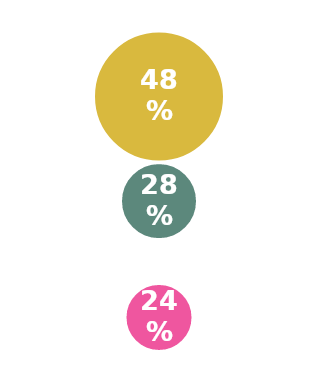
| Category | Series 1 |
|---|---|
| 1.0 | 5.75 |
| 1.0 | 3.5 |
| 1.0 | 1 |